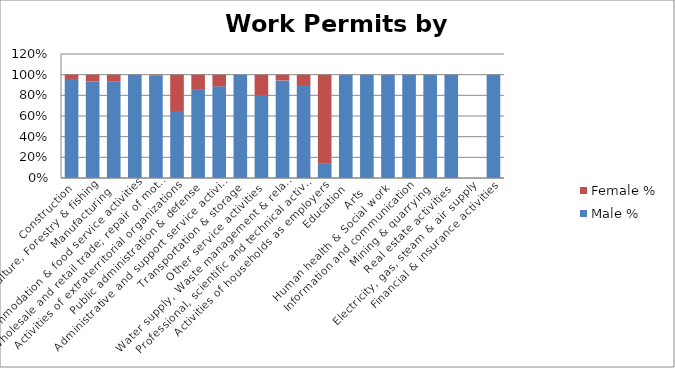
| Category | Male % | Female % |
|---|---|---|
| Construction | 0.958 | 0.042 |
| Agriculture, Forestry & fishing | 0.934 | 0.066 |
| Manufacturing | 0.936 | 0.064 |
| Accommodation & food service activities | 0.999 | 0.001 |
| Wholesale and retail trade; repair of motor vehicles  | 0.99 | 0.01 |
| Activities of extraterritorial organizations  | 0.648 | 0.352 |
| Public administration & defense | 0.853 | 0.147 |
| Administrative and support service activities | 0.887 | 0.113 |
|  Transportation & storage | 1 | 0 |
| Other service activities | 0.795 | 0.205 |
| Water supply, Waste management & related activities | 0.944 | 0.056 |
| Professional, scientific and technical activities | 0.9 | 0.1 |
| Activities of households as employers | 0.139 | 0.861 |
| Education | 1 | 0 |
| Arts | 1 | 0 |
| Human health & Social work | 1 | 0 |
|  Information and communication | 1 | 0 |
| Mining & quarrying | 1 | 0 |
| Real estate activities | 1 | 0 |
| Electricity, gas, steam & air supply | 0 | 0 |
| Financial & insurance activities | 1 | 0 |